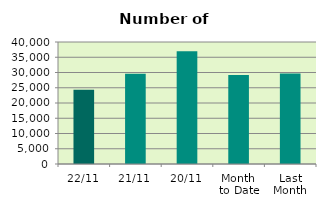
| Category | Series 0 |
|---|---|
| 22/11 | 24334 |
| 21/11 | 29558 |
| 20/11 | 36944 |
| Month 
to Date | 29172.5 |
| Last
Month | 29672.087 |